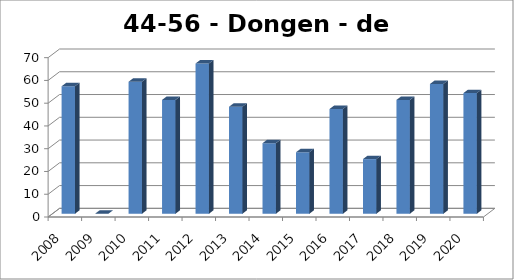
| Category | Dongen - de Moer |
|---|---|
| 2008.0 | 56 |
| 2009.0 | 0 |
| 2010.0 | 58 |
| 2011.0 | 50 |
| 2012.0 | 66 |
| 2013.0 | 47 |
| 2014.0 | 31 |
| 2015.0 | 27 |
| 2016.0 | 46 |
| 2017.0 | 24 |
| 2018.0 | 50 |
| 2019.0 | 57 |
| 2020.0 | 53 |